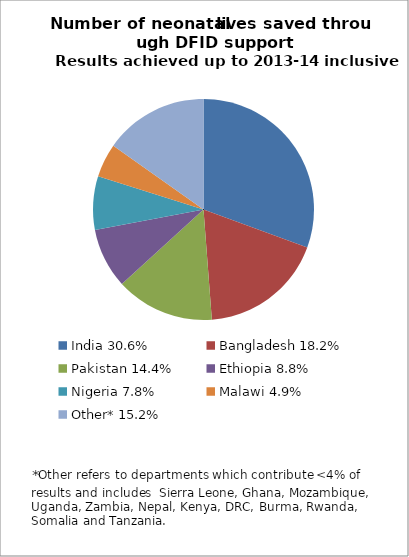
| Category | Series 0 |
|---|---|
| India 30.6% | 30.595 |
| Bangladesh 18.2% | 18.2 |
| Pakistan 14.4% | 14.435 |
| Ethiopia 8.8% | 8.786 |
| Nigeria 7.8% | 7.845 |
| Malawi 4.9% | 4.942 |
| Other* 15.2% | 15.196 |